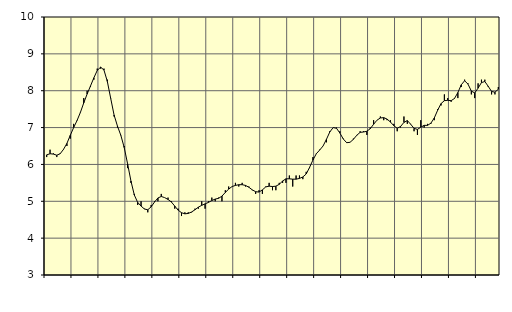
| Category | Piggar | Byggverksamhet, SNI 41-43 |
|---|---|---|
| nan | 6.2 | 6.26 |
| 87.0 | 6.4 | 6.29 |
| 87.0 | 6.3 | 6.28 |
| 87.0 | 6.2 | 6.25 |
| nan | 6.3 | 6.29 |
| 88.0 | 6.4 | 6.41 |
| 88.0 | 6.5 | 6.57 |
| 88.0 | 6.7 | 6.79 |
| nan | 7.1 | 7 |
| 89.0 | 7.2 | 7.19 |
| 89.0 | 7.4 | 7.41 |
| 89.0 | 7.8 | 7.67 |
| nan | 8 | 7.91 |
| 90.0 | 8.1 | 8.13 |
| 90.0 | 8.3 | 8.35 |
| 90.0 | 8.6 | 8.55 |
| nan | 8.6 | 8.64 |
| 91.0 | 8.6 | 8.56 |
| 91.0 | 8.3 | 8.25 |
| 91.0 | 7.8 | 7.79 |
| nan | 7.3 | 7.34 |
| 92.0 | 7 | 7.04 |
| 92.0 | 6.8 | 6.79 |
| 92.0 | 6.5 | 6.46 |
| nan | 5.9 | 6.02 |
| 93.0 | 5.5 | 5.55 |
| 93.0 | 5.2 | 5.17 |
| 93.0 | 4.9 | 4.97 |
| nan | 5 | 4.87 |
| 94.0 | 4.8 | 4.79 |
| 94.0 | 4.7 | 4.77 |
| 94.0 | 4.9 | 4.85 |
| nan | 5 | 4.98 |
| 95.0 | 5 | 5.09 |
| 95.0 | 5.2 | 5.13 |
| 95.0 | 5.1 | 5.1 |
| nan | 5.1 | 5.05 |
| 96.0 | 5 | 4.98 |
| 96.0 | 4.8 | 4.87 |
| 96.0 | 4.8 | 4.76 |
| nan | 4.6 | 4.69 |
| 97.0 | 4.7 | 4.66 |
| 97.0 | 4.7 | 4.67 |
| 97.0 | 4.7 | 4.71 |
| nan | 4.8 | 4.77 |
| 98.0 | 4.8 | 4.84 |
| 98.0 | 5 | 4.89 |
| 98.0 | 4.8 | 4.93 |
| nan | 5 | 4.97 |
| 99.0 | 5.1 | 5.02 |
| 99.0 | 5 | 5.06 |
| 99.0 | 5.1 | 5.08 |
| nan | 5 | 5.14 |
| 0.0 | 5.3 | 5.24 |
| 0.0 | 5.4 | 5.33 |
| 0.0 | 5.4 | 5.4 |
| nan | 5.5 | 5.43 |
| 1.0 | 5.4 | 5.45 |
| 1.0 | 5.5 | 5.45 |
| 1.0 | 5.4 | 5.43 |
| nan | 5.4 | 5.38 |
| 2.0 | 5.3 | 5.31 |
| 2.0 | 5.2 | 5.26 |
| 2.0 | 5.3 | 5.25 |
| nan | 5.2 | 5.31 |
| 3.0 | 5.4 | 5.39 |
| 3.0 | 5.5 | 5.41 |
| 3.0 | 5.3 | 5.4 |
| nan | 5.3 | 5.41 |
| 4.0 | 5.5 | 5.46 |
| 4.0 | 5.5 | 5.55 |
| 4.0 | 5.5 | 5.61 |
| nan | 5.7 | 5.61 |
| 5.0 | 5.4 | 5.6 |
| 5.0 | 5.7 | 5.6 |
| 5.0 | 5.7 | 5.62 |
| nan | 5.6 | 5.66 |
| 6.0 | 5.8 | 5.74 |
| 6.0 | 5.9 | 5.92 |
| 6.0 | 6.2 | 6.12 |
| nan | 6.3 | 6.29 |
| 7.0 | 6.4 | 6.39 |
| 7.0 | 6.5 | 6.5 |
| 7.0 | 6.6 | 6.68 |
| nan | 6.9 | 6.88 |
| 8.0 | 7 | 7 |
| 8.0 | 7 | 6.98 |
| 8.0 | 6.9 | 6.85 |
| nan | 6.7 | 6.69 |
| 9.0 | 6.6 | 6.59 |
| 9.0 | 6.6 | 6.6 |
| 9.0 | 6.7 | 6.68 |
| nan | 6.8 | 6.79 |
| 10.0 | 6.9 | 6.87 |
| 10.0 | 6.9 | 6.88 |
| 10.0 | 6.8 | 6.9 |
| nan | 7 | 6.97 |
| 11.0 | 7.2 | 7.09 |
| 11.0 | 7.2 | 7.2 |
| 11.0 | 7.3 | 7.26 |
| nan | 7.2 | 7.27 |
| 12.0 | 7.2 | 7.23 |
| 12.0 | 7.2 | 7.15 |
| 12.0 | 7.1 | 7.05 |
| nan | 6.9 | 6.98 |
| 13.0 | 7 | 7.03 |
| 13.0 | 7.3 | 7.14 |
| 13.0 | 7.1 | 7.19 |
| nan | 7.1 | 7.09 |
| 14.0 | 6.9 | 6.98 |
| 14.0 | 6.8 | 6.95 |
| 14.0 | 7.2 | 7.01 |
| nan | 7 | 7.06 |
| 15.0 | 7.1 | 7.06 |
| 15.0 | 7.1 | 7.12 |
| 15.0 | 7.2 | 7.26 |
| nan | 7.5 | 7.47 |
| 16.0 | 7.6 | 7.65 |
| 16.0 | 7.9 | 7.73 |
| 16.0 | 7.8 | 7.74 |
| nan | 7.7 | 7.73 |
| 17.0 | 7.8 | 7.79 |
| 17.0 | 7.8 | 7.95 |
| 17.0 | 8.1 | 8.16 |
| nan | 8.3 | 8.27 |
| 18.0 | 8.2 | 8.18 |
| 18.0 | 7.9 | 7.99 |
| 18.0 | 7.8 | 7.94 |
| nan | 8.2 | 8.07 |
| 19.0 | 8.3 | 8.22 |
| 19.0 | 8.3 | 8.25 |
| 19.0 | 8.1 | 8.12 |
| nan | 7.9 | 7.98 |
| 20.0 | 7.9 | 7.96 |
| 20.0 | 8.1 | 8.04 |